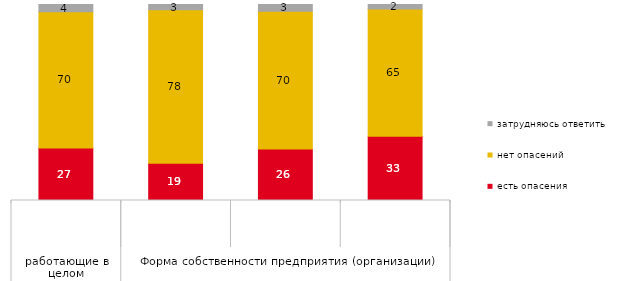
| Category | есть опасения | нет опасений | затрудняюсь ответить |
|---|---|---|---|
| 0 | 26.724 | 69.636 | 3.64 |
| 1 | 19.006 | 78.363 | 2.632 |
| 2 | 26.271 | 70.339 | 3.39 |
| 3 | 32.768 | 64.972 | 2.26 |